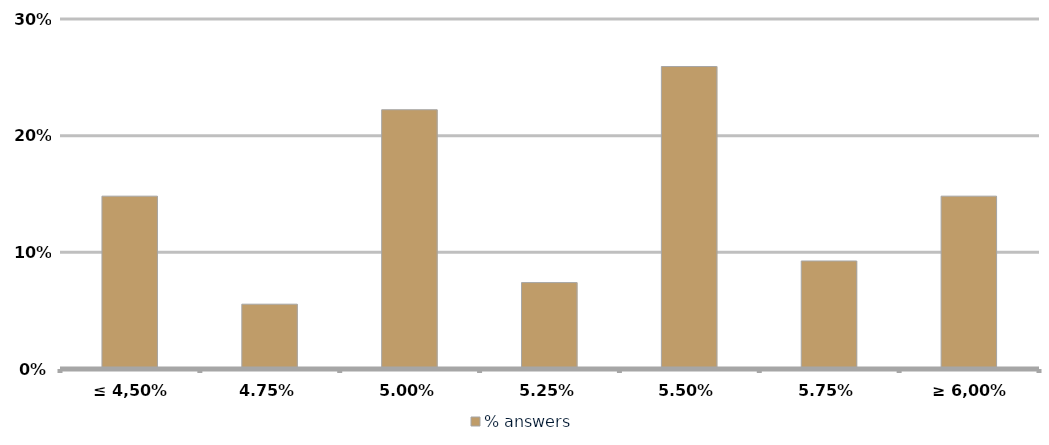
| Category | % answers |
|---|---|
| ≤ 4,50% | 0.148 |
| 4,75% | 0.056 |
| 5,00% | 0.222 |
| 5,25% | 0.074 |
| 5,50% | 0.259 |
| 5,75% | 0.093 |
| ≥ 6,00% | 0.148 |